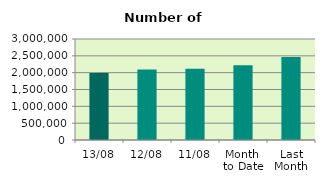
| Category | Series 0 |
|---|---|
| 13/08 | 1988102 |
| 12/08 | 2094230 |
| 11/08 | 2114590 |
| Month 
to Date | 2223112.8 |
| Last
Month | 2465054.636 |